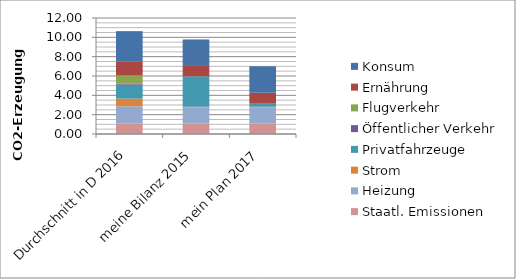
| Category | Staatl. Emissionen | Heizung | Strom | Privatfahrzeuge | Öffentlicher Verkehr | Flugverkehr | Ernährung | Konsum |
|---|---|---|---|---|---|---|---|---|
| Durchschnitt in D 2016 | 1.08 | 1.79 | 0.79 | 1.44 | 0.12 | 0.84 | 1.43 | 3.15 |
| meine Bilanz 2015 | 1.08 | 1.69 | 0.05 | 3.15 | 0 | 0 | 1.07 | 2.74 |
| mein Plan 2017 | 1.08 | 1.69 | 0.05 | 0.378 | 0 | 0 | 1.07 | 2.74 |